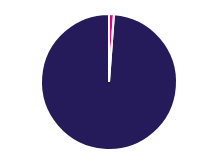
| Category | Series 0 |
|---|---|
| 0 | 3235 |
| 1 | 275828 |